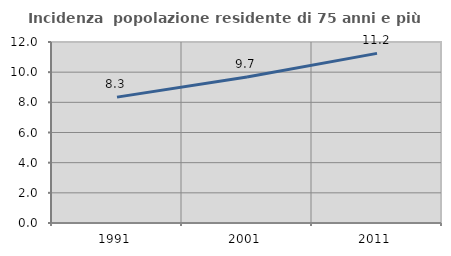
| Category | Incidenza  popolazione residente di 75 anni e più |
|---|---|
| 1991.0 | 8.344 |
| 2001.0 | 9.683 |
| 2011.0 | 11.244 |